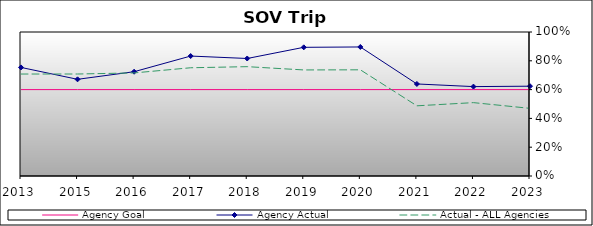
| Category | Agency Goal | Agency Actual | Actual - ALL Agencies |
|---|---|---|---|
| 2013.0 | 0.6 | 0.754 | 0.708 |
| 2015.0 | 0.6 | 0.671 | 0.708 |
| 2016.0 | 0.6 | 0.724 | 0.716 |
| 2017.0 | 0.6 | 0.833 | 0.752 |
| 2018.0 | 0.6 | 0.816 | 0.759 |
| 2019.0 | 0.6 | 0.894 | 0.736 |
| 2020.0 | 0.6 | 0.896 | 0.737 |
| 2021.0 | 0.6 | 0.639 | 0.487 |
| 2022.0 | 0.6 | 0.621 | 0.509 |
| 2023.0 | 0.6 | 0.624 | 0.47 |